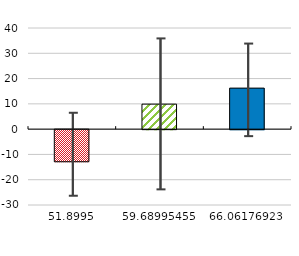
| Category | Average administative efficiency index |
|---|---|
| 51.89950000000001 | -12.699 |
| 59.68995454545454 | 9.894 |
| 66.06176923076924 | 16.224 |